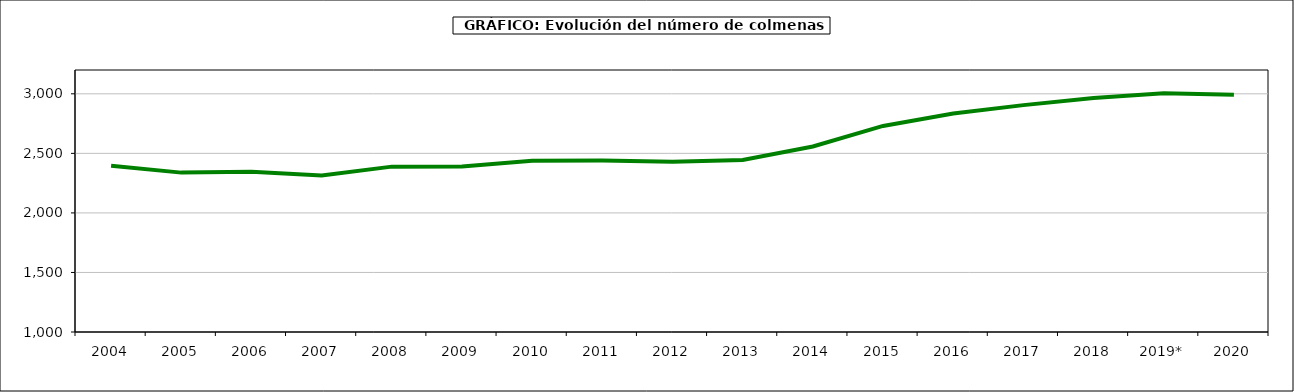
| Category | colmenas |
|---|---|
| 2004 | 2396.686 |
| 2005 | 2338.342 |
| 2006 | 2345.368 |
| 2007 | 2313.454 |
| 2008 | 2388.595 |
| 2009 | 2389.999 |
| 2010 | 2438 |
| 2011 | 2439.718 |
| 2012 | 2430.196 |
| 2013 | 2444.097 |
| 2014 | 2557.301 |
| 2015 | 2730.296 |
| 2016 | 2834.514 |
| 2017 | 2904.971 |
| 2018 | 2965.557 |
| 2019* | 3004.184 |
| 2020 | 2992.974 |